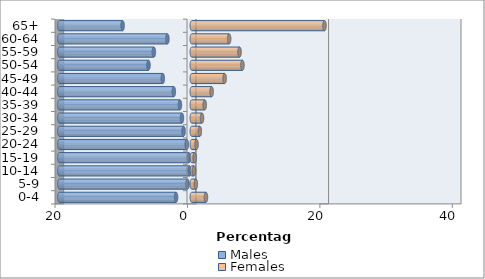
| Category | Males | Females |
|---|---|---|
| 0-4 | -2.372 | 2.143 |
| 5-9 | -0.648 | 0.612 |
| 10-14 | -0.338 | 0.332 |
| 15-19 | -0.434 | 0.427 |
| 20-24 | -0.756 | 0.721 |
| 25-29 | -1.238 | 1.215 |
| 30-34 | -1.484 | 1.541 |
| 35-39 | -1.792 | 1.954 |
| 40-44 | -2.711 | 2.998 |
| 45-49 | -4.376 | 4.961 |
| 50-54 | -6.541 | 7.648 |
| 55-59 | -5.726 | 7.215 |
| 60-64 | -3.685 | 5.643 |
| 65+ | -10.447 | 20.043 |